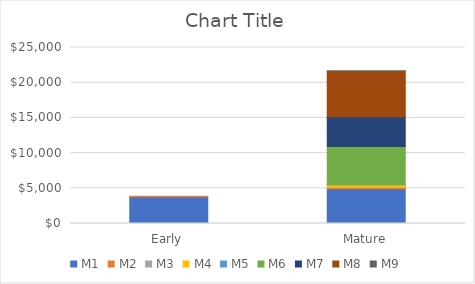
| Category | M1 | M2 | M3 | M4 | M5 | M6 | M7 | M8 | M9 |
|---|---|---|---|---|---|---|---|---|---|
| Early | 3794.061 | 79.5 | 0 | 0 | 0 | 0 | 0 | 0 | 0 |
| Mature | 4952.259 | 182.3 | 9.164 | 348.122 | 4.412 | 5430.025 | 4233.75 | 6490.98 | 24.559 |